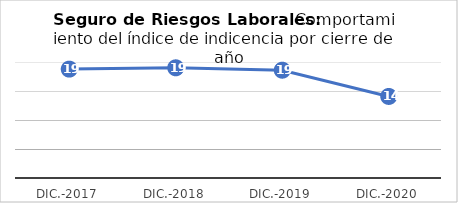
| Category | Series 0 |
|---|---|
| Dic.-2017 | 18.773 |
| Dic.-2018 | 19.001 |
| Dic.-2019 | 18.585 |
| Dic.-2020 | 14.059 |